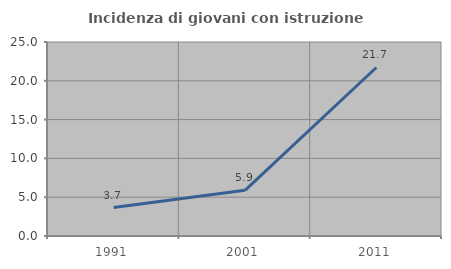
| Category | Incidenza di giovani con istruzione universitaria |
|---|---|
| 1991.0 | 3.659 |
| 2001.0 | 5.882 |
| 2011.0 | 21.714 |